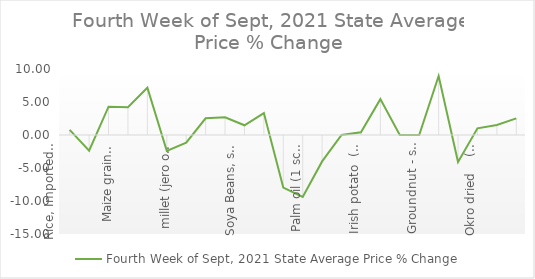
| Category | Fourth Week of Sept, 2021 |
|---|---|
| Rice, Imported, High Quality Sold loose  (1 mudu) | 0.768 |
| Rice, Agric Sold Loose(Low quality) imported  (1 mudu) | -2.375 |
| Rice Local, Sold Loose   (1 mudu) | 4.29 |
| Maize grain, white sold loose   (1 mudu) | 4.198 |
| Maize grain, yellow sold loose   (1 mudu) | 7.162 |
| Sorghum (Guinea Corn) white or brown, sold loose   (1 mudu) | -2.399 |
| millet (jero or maiwa) sold loose   (1 mudu) | -1.164 |
| Beans: white black eye. Sold loose   (1 mudu) | 2.532 |
| Beans Brown, sold loose  (1 mudu) | 2.683 |
| Soya Beans, sold loose    (1 mudu) | 1.472 |
| Gari White, sold loose  (1 mudu) | 3.316 |
| Gari Yellow, sold loose   (1 mudu) | -7.962 |
| Palm oil (1 schnap bottle) | -9.375 |
| Yam tuber (1 Medium Size) | -4 |
| Cassava tuber | 0 |
| Irish potato  (4 Litre rubber) | 0.411 |
| Sweet potato  (5 Medium Size) | 5.435 |
| Local live chicken  | 0 |
| Groundnut - shelled (fresh) | 0 |
| Tomato fresh   (4 Litre rubber) | 8.947 |
| Okro fresh     (1 mudu) | -4.082 |
| Okro dried    (1 mudu) | 1.009 |
| Onion   (4 Litre rubber) | 1.506 |
| Pepper fresh   (4 Litre rubber) | 2.521 |